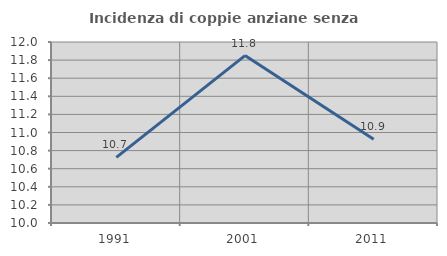
| Category | Incidenza di coppie anziane senza figli  |
|---|---|
| 1991.0 | 10.725 |
| 2001.0 | 11.85 |
| 2011.0 | 10.924 |